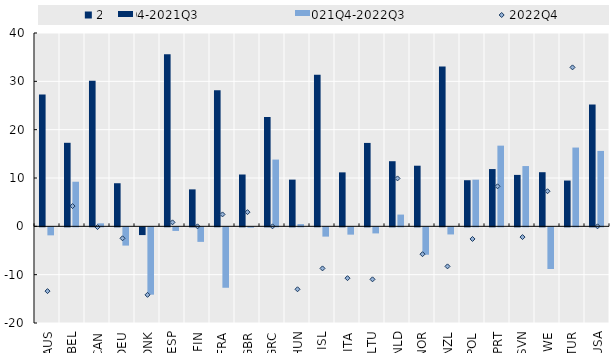
| Category | 2020Q4-2021Q3 | 2021Q4-2022Q3 |
|---|---|---|
| AUS | 27.288 | -1.658 |
| BEL | 17.284 | 9.23 |
| CAN | 30.124 | 0.622 |
| DEU | 8.917 | -3.779 |
| DNK | -1.601 | -13.933 |
| ESP | 35.607 | -0.747 |
| FIN | 7.646 | -3.008 |
| FRA | 28.136 | -12.503 |
| GBR | 10.724 | -0.075 |
| GRC | 22.617 | 13.812 |
| HUN | 9.663 | 0.457 |
| ISL | 31.378 | -1.921 |
| ITA | 11.167 | -1.513 |
| LTU | 17.257 | -1.258 |
| NLD | 13.474 | 2.432 |
| NOR | 12.542 | -5.666 |
| NZL | 33.077 | -1.474 |
| POL | 9.539 | 9.648 |
| PRT | 11.849 | 16.694 |
| SVN | 10.641 | 12.473 |
| SWE | 11.199 | -8.624 |
| TUR | 9.472 | 16.299 |
| USA | 25.204 | 15.604 |